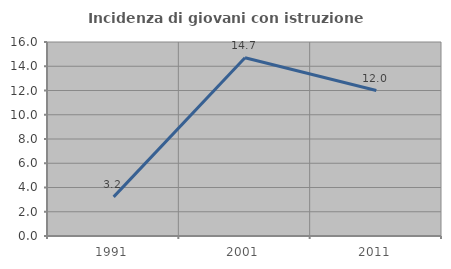
| Category | Incidenza di giovani con istruzione universitaria |
|---|---|
| 1991.0 | 3.226 |
| 2001.0 | 14.706 |
| 2011.0 | 12 |